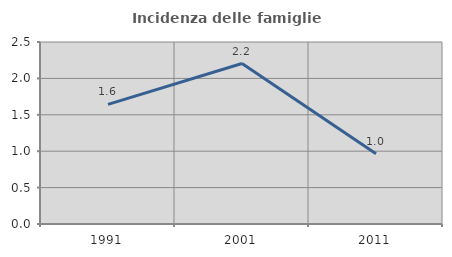
| Category | Incidenza delle famiglie numerose |
|---|---|
| 1991.0 | 1.643 |
| 2001.0 | 2.204 |
| 2011.0 | 0.966 |